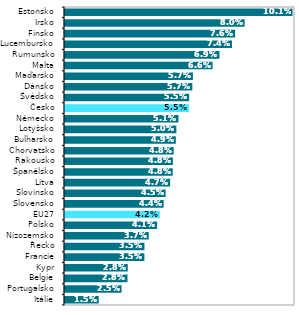
| Category | Series 0 |
|---|---|
| Itálie | 0.015 |
| Portugalsko | 0.025 |
| Belgie | 0.028 |
| Kypr | 0.028 |
| Francie | 0.035 |
| Řecko | 0.035 |
| Nizozemsko | 0.037 |
| Polsko | 0.041 |
| EU27 | 0.042 |
| Slovensko | 0.044 |
| Slovinsko | 0.045 |
| Litva | 0.047 |
| Španělsko | 0.048 |
| Rakousko | 0.048 |
| Chorvatsko | 0.048 |
| Bulharsko | 0.049 |
| Lotyšsko | 0.05 |
| Německo | 0.051 |
| Česko | 0.055 |
| Švédsko | 0.055 |
| Dánsko | 0.057 |
| Maďarsko | 0.057 |
| Malta | 0.066 |
| Rumunsko | 0.069 |
| Lucembursko | 0.074 |
| Finsko | 0.076 |
| Irsko | 0.08 |
| Estonsko | 0.101 |